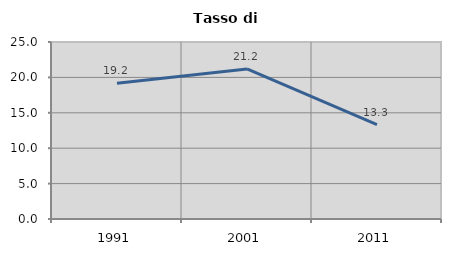
| Category | Tasso di disoccupazione   |
|---|---|
| 1991.0 | 19.185 |
| 2001.0 | 21.197 |
| 2011.0 | 13.333 |